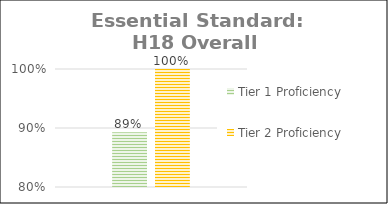
| Category | Tier 1 Proficiency | Tier 2 Proficiency |
|---|---|---|
| Total Class | 0.893 | 1 |